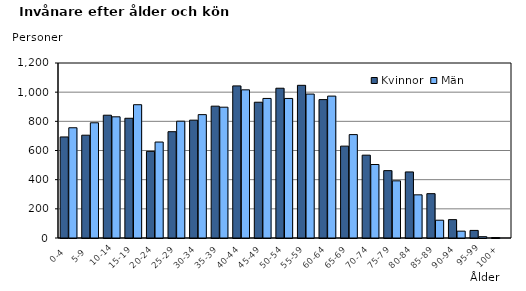
| Category | Kvinnor | Män |
|---|---|---|
|   0-4  | 693 | 756 |
|   5-9  | 705 | 790 |
| 10-14 | 842 | 831 |
| 15-19  | 821 | 914 |
| 20-24  | 594 | 658 |
| 25-29  | 729 | 801 |
| 30-34  | 808 | 846 |
| 35-39  | 904 | 897 |
| 40-44  | 1043 | 1016 |
| 45-49  | 931 | 957 |
| 50-54  | 1027 | 957 |
| 55-59  | 1047 | 987 |
| 60-64  | 949 | 973 |
| 65-69  | 630 | 709 |
| 70-74  | 568 | 504 |
| 75-79  | 462 | 392 |
| 80-84  | 453 | 296 |
| 85-89  | 304 | 122 |
| 90-94  | 126 | 47 |
| 95-99 | 52 | 9 |
| 100+ | 3 | 0 |